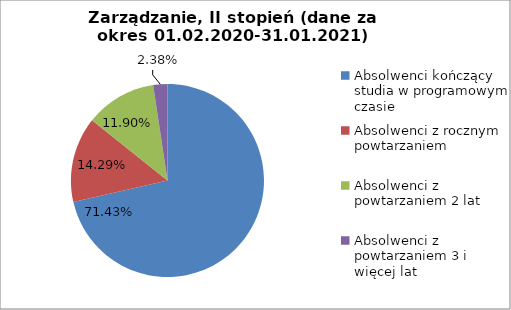
| Category | Series 0 |
|---|---|
| Absolwenci kończący studia w programowym czasie | 71.429 |
| Absolwenci z rocznym powtarzaniem | 14.286 |
| Absolwenci z powtarzaniem 2 lat | 11.905 |
| Absolwenci z powtarzaniem 3 i więcej lat | 2.381 |